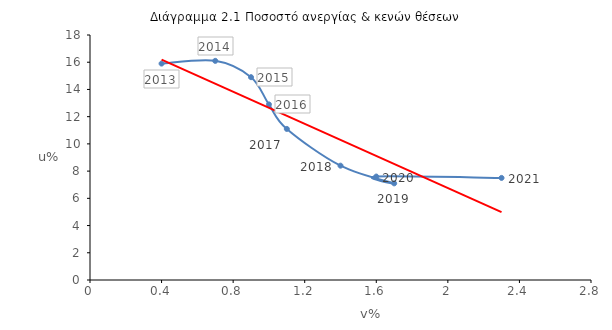
| Category | Ποσοστό ανεργίας |
|---|---|
| 0.4 | 15.9 |
| 0.7 | 16.1 |
| 0.9 | 14.9 |
| 1.0 | 12.9 |
| 1.1 | 11.1 |
| 1.4 | 8.4 |
| 1.7 | 7.1 |
| 1.6 | 7.6 |
| 2.3 | 7.5 |